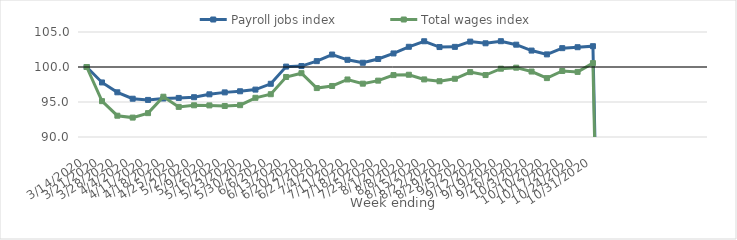
| Category | Payroll jobs index | Total wages index |
|---|---|---|
| 14/03/2020 | 100 | 100 |
| 21/03/2020 | 97.793 | 95.122 |
| 28/03/2020 | 96.385 | 93.041 |
| 04/04/2020 | 95.467 | 92.771 |
| 11/04/2020 | 95.297 | 93.41 |
| 18/04/2020 | 95.499 | 95.756 |
| 25/04/2020 | 95.582 | 94.302 |
| 02/05/2020 | 95.684 | 94.531 |
| 09/05/2020 | 96.098 | 94.514 |
| 16/05/2020 | 96.374 | 94.432 |
| 23/05/2020 | 96.532 | 94.548 |
| 30/05/2020 | 96.77 | 95.599 |
| 06/06/2020 | 97.602 | 96.112 |
| 13/06/2020 | 100.057 | 98.572 |
| 20/06/2020 | 100.135 | 99.117 |
| 27/06/2020 | 100.838 | 96.99 |
| 04/07/2020 | 101.779 | 97.289 |
| 11/07/2020 | 101.025 | 98.219 |
| 18/07/2020 | 100.604 | 97.62 |
| 25/07/2020 | 101.144 | 98.051 |
| 01/08/2020 | 101.937 | 98.842 |
| 08/08/2020 | 102.886 | 98.892 |
| 15/08/2020 | 103.677 | 98.227 |
| 22/08/2020 | 102.85 | 97.964 |
| 29/08/2020 | 102.877 | 98.318 |
| 05/09/2020 | 103.626 | 99.268 |
| 12/09/2020 | 103.388 | 98.85 |
| 19/09/2020 | 103.686 | 99.758 |
| 26/09/2020 | 103.188 | 99.906 |
| 03/10/2020 | 102.347 | 99.352 |
| 10/10/2020 | 101.802 | 98.415 |
| 17/10/2020 | 102.693 | 99.43 |
| 24/10/2020 | 102.827 | 99.3 |
| 31/10/2020 | 102.972 | 100.556 |